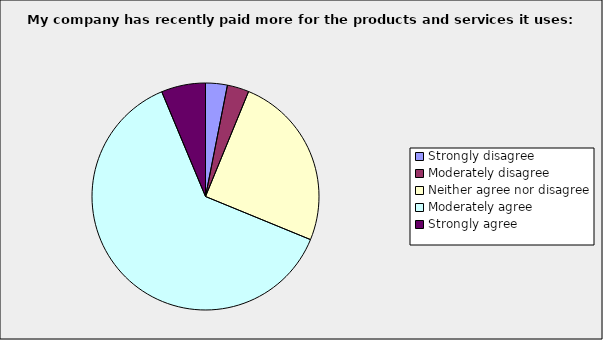
| Category | Series 0 |
|---|---|
| Strongly disagree | 0.031 |
| Moderately disagree | 0.031 |
| Neither agree nor disagree | 0.25 |
| Moderately agree | 0.625 |
| Strongly agree | 0.063 |